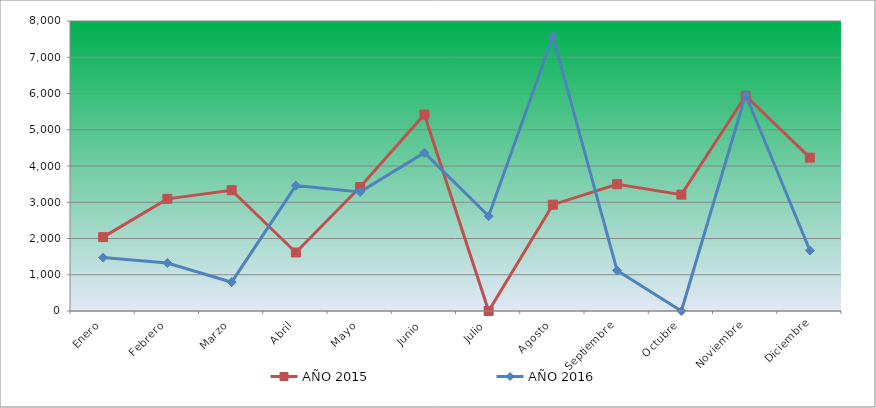
| Category | AÑO 2015 | AÑO 2016 |
|---|---|---|
| Enero | 2037.459 | 1473.909 |
| Febrero | 3093.856 | 1323.348 |
| Marzo | 3331.64 | 796.386 |
| Abril | 1614.545 | 3459.738 |
| Mayo | 3419.084 | 3284.117 |
| Junio | 5420 | 4365.88 |
| Julio | 0 | 2616.756 |
| Agosto | 2933.025 | 7581.679 |
| Septiembre | 3497.784 | 1115.195 |
| Octubre | 3209.217 | 0 |
| Noviembre | 5937.489 | 5964.552 |
| Diciembre | 4229.786 | 1668.402 |